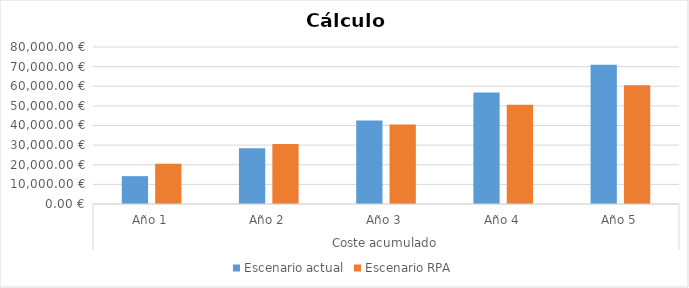
| Category | Escenario actual | Escenario RPA |
|---|---|---|
| 0 | 14192 | 20560 |
| 1 | 28384 | 30560 |
| 2 | 42576 | 40560 |
| 3 | 56768 | 50560 |
| 4 | 70960 | 60560 |